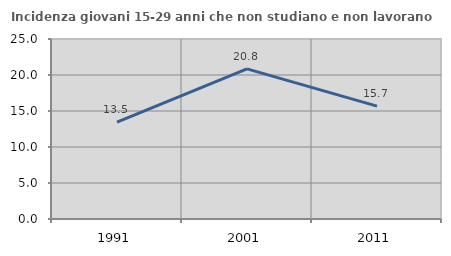
| Category | Incidenza giovani 15-29 anni che non studiano e non lavorano  |
|---|---|
| 1991.0 | 13.465 |
| 2001.0 | 20.845 |
| 2011.0 | 15.679 |